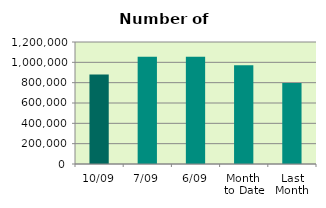
| Category | Series 0 |
|---|---|
| 10/09 | 879374 |
| 7/09 | 1055998 |
| 6/09 | 1054156 |
| Month 
to Date | 971287 |
| Last
Month | 797310 |